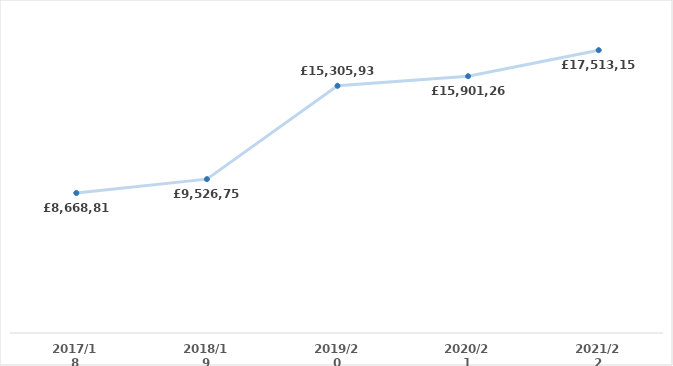
| Category | Series 0 |
|---|---|
| 2017/18 | 8668812.97 |
| 2018/19 | 9526758 |
| 2019/20 | 15305934.4 |
| 2020/21 | 15901265.76 |
| 2021/22 | 17513155.55 |